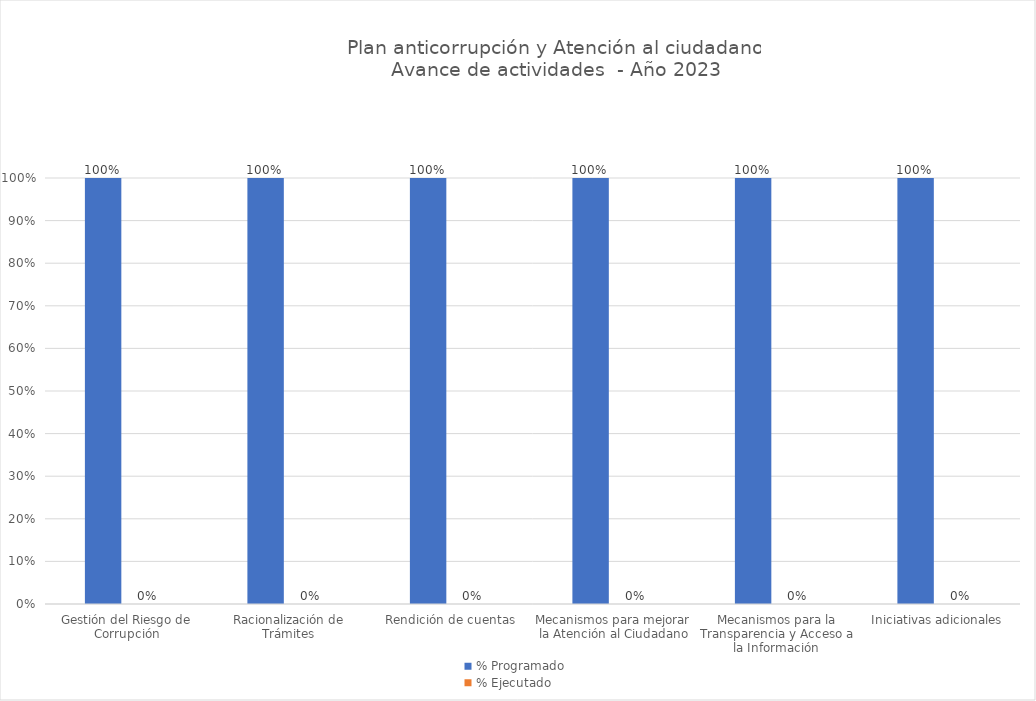
| Category | % Programado | % Ejecutado |
|---|---|---|
| Gestión del Riesgo de Corrupción | 1 | 0 |
| Racionalización de Trámites | 1 | 0 |
| Rendición de cuentas | 1 | 0 |
| Mecanismos para mejorar la Atención al Ciudadano | 1 | 0 |
| Mecanismos para la Transparencia y Acceso a la Información | 1 | 0 |
| Iniciativas adicionales | 1 | 0 |